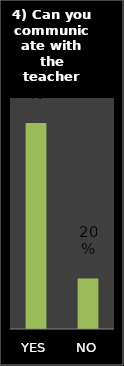
| Category | Series 0 |
|---|---|
| YES | 0.803 |
| NO | 0.197 |